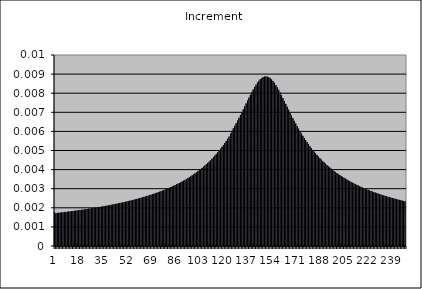
| Category | Increment |
|---|---|
| 0 | 0.002 |
| 1 | 0.002 |
| 2 | 0.002 |
| 3 | 0.002 |
| 4 | 0.002 |
| 5 | 0.002 |
| 6 | 0.002 |
| 7 | 0.002 |
| 8 | 0.002 |
| 9 | 0.002 |
| 10 | 0.002 |
| 11 | 0.002 |
| 12 | 0.002 |
| 13 | 0.002 |
| 14 | 0.002 |
| 15 | 0.002 |
| 16 | 0.002 |
| 17 | 0.002 |
| 18 | 0.002 |
| 19 | 0.002 |
| 20 | 0.002 |
| 21 | 0.002 |
| 22 | 0.002 |
| 23 | 0.002 |
| 24 | 0.002 |
| 25 | 0.002 |
| 26 | 0.002 |
| 27 | 0.002 |
| 28 | 0.002 |
| 29 | 0.002 |
| 30 | 0.002 |
| 31 | 0.002 |
| 32 | 0.002 |
| 33 | 0.002 |
| 34 | 0.002 |
| 35 | 0.002 |
| 36 | 0.002 |
| 37 | 0.002 |
| 38 | 0.002 |
| 39 | 0.002 |
| 40 | 0.002 |
| 41 | 0.002 |
| 42 | 0.002 |
| 43 | 0.002 |
| 44 | 0.002 |
| 45 | 0.002 |
| 46 | 0.002 |
| 47 | 0.002 |
| 48 | 0.002 |
| 49 | 0.002 |
| 50 | 0.002 |
| 51 | 0.002 |
| 52 | 0.002 |
| 53 | 0.002 |
| 54 | 0.002 |
| 55 | 0.002 |
| 56 | 0.002 |
| 57 | 0.002 |
| 58 | 0.002 |
| 59 | 0.002 |
| 60 | 0.003 |
| 61 | 0.003 |
| 62 | 0.003 |
| 63 | 0.003 |
| 64 | 0.003 |
| 65 | 0.003 |
| 66 | 0.003 |
| 67 | 0.003 |
| 68 | 0.003 |
| 69 | 0.003 |
| 70 | 0.003 |
| 71 | 0.003 |
| 72 | 0.003 |
| 73 | 0.003 |
| 74 | 0.003 |
| 75 | 0.003 |
| 76 | 0.003 |
| 77 | 0.003 |
| 78 | 0.003 |
| 79 | 0.003 |
| 80 | 0.003 |
| 81 | 0.003 |
| 82 | 0.003 |
| 83 | 0.003 |
| 84 | 0.003 |
| 85 | 0.003 |
| 86 | 0.003 |
| 87 | 0.003 |
| 88 | 0.003 |
| 89 | 0.003 |
| 90 | 0.003 |
| 91 | 0.003 |
| 92 | 0.003 |
| 93 | 0.004 |
| 94 | 0.004 |
| 95 | 0.004 |
| 96 | 0.004 |
| 97 | 0.004 |
| 98 | 0.004 |
| 99 | 0.004 |
| 100 | 0.004 |
| 101 | 0.004 |
| 102 | 0.004 |
| 103 | 0.004 |
| 104 | 0.004 |
| 105 | 0.004 |
| 106 | 0.004 |
| 107 | 0.004 |
| 108 | 0.004 |
| 109 | 0.004 |
| 110 | 0.004 |
| 111 | 0.005 |
| 112 | 0.005 |
| 113 | 0.005 |
| 114 | 0.005 |
| 115 | 0.005 |
| 116 | 0.005 |
| 117 | 0.005 |
| 118 | 0.005 |
| 119 | 0.005 |
| 120 | 0.005 |
| 121 | 0.006 |
| 122 | 0.006 |
| 123 | 0.006 |
| 124 | 0.006 |
| 125 | 0.006 |
| 126 | 0.006 |
| 127 | 0.006 |
| 128 | 0.006 |
| 129 | 0.007 |
| 130 | 0.007 |
| 131 | 0.007 |
| 132 | 0.007 |
| 133 | 0.007 |
| 134 | 0.007 |
| 135 | 0.007 |
| 136 | 0.008 |
| 137 | 0.008 |
| 138 | 0.008 |
| 139 | 0.008 |
| 140 | 0.008 |
| 141 | 0.008 |
| 142 | 0.008 |
| 143 | 0.009 |
| 144 | 0.009 |
| 145 | 0.009 |
| 146 | 0.009 |
| 147 | 0.009 |
| 148 | 0.009 |
| 149 | 0.009 |
| 150 | 0.009 |
| 151 | 0.009 |
| 152 | 0.009 |
| 153 | 0.009 |
| 154 | 0.009 |
| 155 | 0.009 |
| 156 | 0.008 |
| 157 | 0.008 |
| 158 | 0.008 |
| 159 | 0.008 |
| 160 | 0.008 |
| 161 | 0.008 |
| 162 | 0.008 |
| 163 | 0.007 |
| 164 | 0.007 |
| 165 | 0.007 |
| 166 | 0.007 |
| 167 | 0.007 |
| 168 | 0.007 |
| 169 | 0.007 |
| 170 | 0.006 |
| 171 | 0.006 |
| 172 | 0.006 |
| 173 | 0.006 |
| 174 | 0.006 |
| 175 | 0.006 |
| 176 | 0.006 |
| 177 | 0.006 |
| 178 | 0.005 |
| 179 | 0.005 |
| 180 | 0.005 |
| 181 | 0.005 |
| 182 | 0.005 |
| 183 | 0.005 |
| 184 | 0.005 |
| 185 | 0.005 |
| 186 | 0.005 |
| 187 | 0.005 |
| 188 | 0.005 |
| 189 | 0.004 |
| 190 | 0.004 |
| 191 | 0.004 |
| 192 | 0.004 |
| 193 | 0.004 |
| 194 | 0.004 |
| 195 | 0.004 |
| 196 | 0.004 |
| 197 | 0.004 |
| 198 | 0.004 |
| 199 | 0.004 |
| 200 | 0.004 |
| 201 | 0.004 |
| 202 | 0.004 |
| 203 | 0.004 |
| 204 | 0.004 |
| 205 | 0.004 |
| 206 | 0.003 |
| 207 | 0.003 |
| 208 | 0.003 |
| 209 | 0.003 |
| 210 | 0.003 |
| 211 | 0.003 |
| 212 | 0.003 |
| 213 | 0.003 |
| 214 | 0.003 |
| 215 | 0.003 |
| 216 | 0.003 |
| 217 | 0.003 |
| 218 | 0.003 |
| 219 | 0.003 |
| 220 | 0.003 |
| 221 | 0.003 |
| 222 | 0.003 |
| 223 | 0.003 |
| 224 | 0.003 |
| 225 | 0.003 |
| 226 | 0.003 |
| 227 | 0.003 |
| 228 | 0.003 |
| 229 | 0.003 |
| 230 | 0.003 |
| 231 | 0.003 |
| 232 | 0.003 |
| 233 | 0.003 |
| 234 | 0.003 |
| 235 | 0.003 |
| 236 | 0.003 |
| 237 | 0.003 |
| 238 | 0.003 |
| 239 | 0.002 |
| 240 | 0.002 |
| 241 | 0.002 |
| 242 | 0.002 |
| 243 | 0.002 |
| 244 | 0.002 |
| 245 | 0.002 |
| 246 | 0.002 |
| 247 | 0.002 |